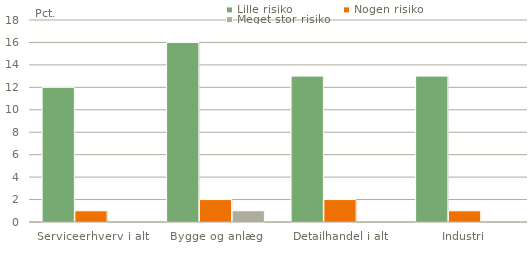
| Category | Lille risiko | Nogen risiko | Meget stor risiko |
|---|---|---|---|
| Serviceerhverv i alt | 12 | 1 | 0 |
| Bygge og anlæg | 16 | 2 | 1 |
| Detailhandel i alt | 13 | 2 | 0 |
| Industri | 13 | 1 | 0 |